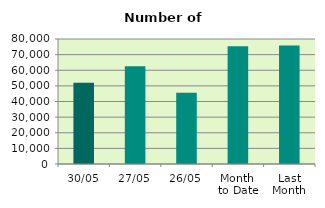
| Category | Series 0 |
|---|---|
| 30/05 | 52074 |
| 27/05 | 62630 |
| 26/05 | 45674 |
| Month 
to Date | 75321.3 |
| Last
Month | 75814.526 |